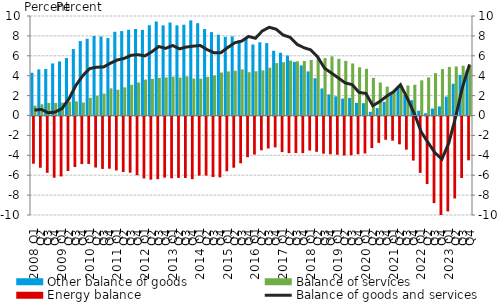
| Category | Other balance of goods | Balance of services |
|---|---|---|
| 2008 Q1 | 4.299 | 0.991 |
| Q2 | 4.634 | 1.126 |
| Q3 | 4.673 | 1.261 |
| Q4 | 5.232 | 1.264 |
| 2009 Q1 | 5.436 | 1.297 |
| Q2 | 5.771 | 1.387 |
| Q3 | 6.679 | 1.424 |
| Q4 | 7.484 | 1.307 |
| 2010 Q1 | 7.713 | 1.775 |
| Q2 | 7.991 | 1.992 |
| Q3 | 7.944 | 2.199 |
| Q4 | 7.776 | 2.729 |
| 2011 Q1 | 8.414 | 2.594 |
| Q2 | 8.486 | 2.83 |
| Q3 | 8.617 | 3.083 |
| Q4 | 8.696 | 3.32 |
| 2012 Q1 | 8.607 | 3.608 |
| Q2 | 9.073 | 3.681 |
| Q3 | 9.448 | 3.782 |
| Q4 | 9.061 | 3.828 |
| 2013 Q1 | 9.341 | 3.903 |
| Q2 | 9.06 | 3.811 |
| Q3 | 9.126 | 3.931 |
| Q4 | 9.561 | 3.711 |
| 2014 Q1 | 9.279 | 3.702 |
| Q2 | 8.69 | 3.872 |
| Q3 | 8.379 | 4.019 |
| Q4 | 8.117 | 4.317 |
| 2015 Q1 | 7.912 | 4.429 |
| Q2 | 7.955 | 4.501 |
| Q3 | 7.544 | 4.636 |
| Q4 | 7.681 | 4.351 |
| 2016 Q1 | 7.139 | 4.446 |
| Q2 | 7.362 | 4.537 |
| Q3 | 7.281 | 4.801 |
| Q4 | 6.509 | 5.268 |
| 2017 Q1 | 6.306 | 5.358 |
| Q2 | 6.029 | 5.515 |
| Q3 | 5.387 | 5.445 |
| Q4 | 5.033 | 5.471 |
| 2018 Q1 | 4.429 | 5.587 |
| Q2 | 3.744 | 5.699 |
| Q3 | 2.718 | 5.775 |
| Q4 | 2.118 | 5.944 |
| 2019 Q1 | 1.924 | 5.699 |
| Q2 | 1.706 | 5.485 |
| Q3 | 1.771 | 5.229 |
| Q4 | 1.275 | 4.843 |
| 2020 Q1 | 1.238 | 4.692 |
| Q2 | 0.37 | 3.78 |
| Q3 | 0.741 | 3.315 |
| Q4 | 1.371 | 2.907 |
| 2021 Q1 | 2.353 | 2.461 |
| Q2 | 2.905 | 2.969 |
| Q3 | 2.039 | 3.013 |
| Q4 | 1.542 | 3.09 |
| 2022 Q1 | 0.479 | 3.535 |
| Q2 | 0.224 | 3.825 |
| Q3 | 0.699 | 4.259 |
| Q4 | 0.912 | 4.662 |
| 2023 Q1 | 1.903 | 4.884 |
| Q2 | 3.197 | 4.932 |
| Q3 | 4.08 | 5.002 |
| Q4 | 4.546 | 4.994 |